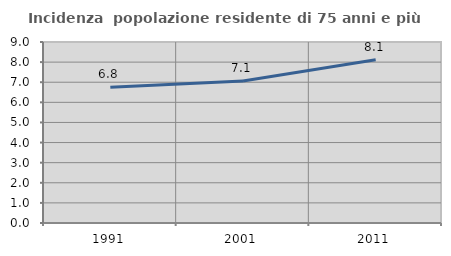
| Category | Incidenza  popolazione residente di 75 anni e più |
|---|---|
| 1991.0 | 6.751 |
| 2001.0 | 7.065 |
| 2011.0 | 8.112 |